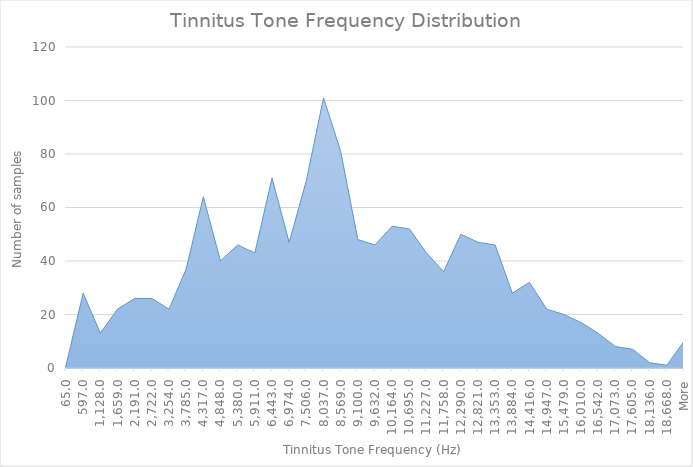
| Category | Frequency |
|---|---|
| 65 | 1 |
| 597 | 28 |
| 1128 | 13 |
| 1659 | 22 |
| 2191 | 26 |
| 2722 | 26 |
| 3254 | 22 |
| 3785 | 37 |
| 4317 | 64 |
| 4848 | 40 |
| 5380 | 46 |
| 5911 | 43 |
| 6443 | 71 |
| 6974 | 47 |
| 7506 | 70 |
| 8037 | 101 |
| 8569 | 81 |
| 9100 | 48 |
| 9632 | 46 |
| 10164 | 53 |
| 10695 | 52 |
| 11227 | 43 |
| 11758 | 36 |
| 12290 | 50 |
| 12821 | 47 |
| 13353 | 46 |
| 13884 | 28 |
| 14416 | 32 |
| 14947 | 22 |
| 15479 | 20 |
| 16010 | 17 |
| 16542 | 13 |
| 17073 | 8 |
| 17605 | 7 |
| 18136 | 2 |
| 18668 | 1 |
| More | 10 |